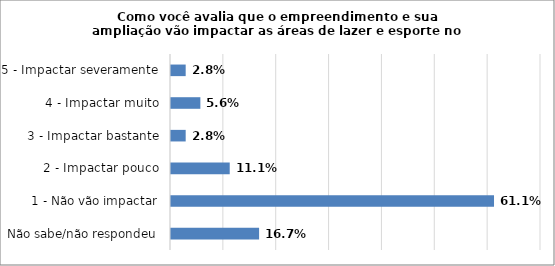
| Category | Series 0 |
|---|---|
| Não sabe/não respondeu | 0.167 |
| 1 - Não vão impactar | 0.611 |
| 2 - Impactar pouco | 0.111 |
| 3 - Impactar bastante | 0.028 |
| 4 - Impactar muito | 0.056 |
| 5 - Impactar severamente | 0.028 |